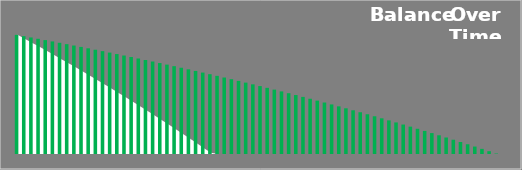
| Category | MinPmt |
|---|---|
| 0 | 12000 |
| 1 | 11870 |
| 2 | 11738.81 |
| 3 | 11606.42 |
| 4 | 11472.81 |
| 5 | 11337.98 |
| 6 | 11201.91 |
| 7 | 11064.59 |
| 8 | 10926.02 |
| 9 | 10786.18 |
| 10 | 10645.05 |
| 11 | 10502.63 |
| 12 | 10358.9 |
| 13 | 10213.86 |
| 14 | 10067.49 |
| 15 | 9919.78 |
| 16 | 9770.71 |
| 17 | 9620.27 |
| 18 | 9468.46 |
| 19 | 9315.25 |
| 20 | 9160.64 |
| 21 | 9004.61 |
| 22 | 8847.15 |
| 23 | 8688.25 |
| 24 | 8527.89 |
| 25 | 8366.06 |
| 26 | 8202.75 |
| 27 | 8037.94 |
| 28 | 7871.62 |
| 29 | 7703.78 |
| 30 | 7534.4 |
| 31 | 7363.47 |
| 32 | 7190.97 |
| 33 | 7016.89 |
| 34 | 6841.21 |
| 35 | 6663.92 |
| 36 | 6485.01 |
| 37 | 6304.46 |
| 38 | 6122.25 |
| 39 | 5938.37 |
| 40 | 5752.81 |
| 41 | 5565.54 |
| 42 | 5376.56 |
| 43 | 5185.85 |
| 44 | 4993.39 |
| 45 | 4799.16 |
| 46 | 4603.15 |
| 47 | 4405.35 |
| 48 | 4205.73 |
| 49 | 4004.28 |
| 50 | 3800.99 |
| 51 | 3595.83 |
| 52 | 3388.79 |
| 53 | 3179.85 |
| 54 | 2969 |
| 55 | 2756.22 |
| 56 | 2541.49 |
| 57 | 2324.79 |
| 58 | 2106.1 |
| 59 | 1885.41 |
| 60 | 1662.69 |
| 61 | 1437.93 |
| 62 | 1211.11 |
| 63 | 982.21 |
| 64 | 751.21 |
| 65 | 518.1 |
| 66 | 282.85 |
| 67 | 45.44 |
| 68 | 0 |